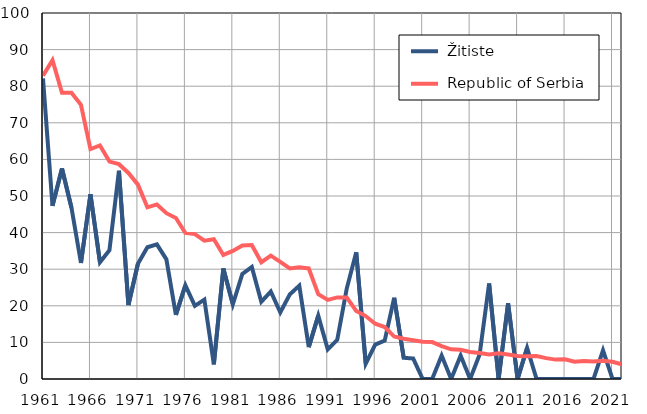
| Category |  Žitiste |  Republic of Serbia |
|---|---|---|
| 1961.0 | 82.1 | 82.9 |
| 1962.0 | 47.3 | 87.1 |
| 1963.0 | 57.5 | 78.2 |
| 1964.0 | 46.8 | 78.2 |
| 1965.0 | 31.7 | 74.9 |
| 1966.0 | 50.5 | 62.8 |
| 1967.0 | 31.9 | 63.8 |
| 1968.0 | 35.2 | 59.4 |
| 1969.0 | 56.9 | 58.7 |
| 1970.0 | 20.2 | 56.3 |
| 1971.0 | 31.5 | 53.1 |
| 1972.0 | 36 | 46.9 |
| 1973.0 | 36.8 | 47.7 |
| 1974.0 | 32.7 | 45.3 |
| 1975.0 | 17.5 | 44 |
| 1976.0 | 25.6 | 39.9 |
| 1977.0 | 20 | 39.6 |
| 1978.0 | 21.7 | 37.8 |
| 1979.0 | 4 | 38.2 |
| 1980.0 | 30.2 | 33.9 |
| 1981.0 | 20.4 | 35 |
| 1982.0 | 28.7 | 36.5 |
| 1983.0 | 30.6 | 36.6 |
| 1984.0 | 21.1 | 31.9 |
| 1985.0 | 23.9 | 33.7 |
| 1986.0 | 18.2 | 32 |
| 1987.0 | 23.1 | 30.2 |
| 1988.0 | 25.5 | 30.5 |
| 1989.0 | 8.7 | 30.2 |
| 1990.0 | 17.3 | 23.2 |
| 1991.0 | 8.1 | 21.6 |
| 1992.0 | 10.7 | 22.3 |
| 1993.0 | 24.7 | 22.3 |
| 1994.0 | 34.6 | 18.6 |
| 1995.0 | 4.2 | 17.2 |
| 1996.0 | 9.4 | 15.1 |
| 1997.0 | 10.5 | 14.2 |
| 1998.0 | 22.2 | 11.6 |
| 1999.0 | 5.8 | 11 |
| 2000.0 | 5.6 | 10.6 |
| 2001.0 | 0 | 10.2 |
| 2002.0 | 0 | 10.1 |
| 2003.0 | 6.4 | 9 |
| 2004.0 | 0 | 8.1 |
| 2005.0 | 6.4 | 8 |
| 2006.0 | 0 | 7.4 |
| 2007.0 | 6.7 | 7.1 |
| 2008.0 | 26.1 | 6.7 |
| 2009.0 | 0 | 7 |
| 2010.0 | 20.7 | 6.7 |
| 2011.0 | 0 | 6.3 |
| 2012.0 | 8.5 | 6.2 |
| 2013.0 | 0 | 6.3 |
| 2014.0 | 0 | 5.7 |
| 2015.0 | 0 | 5.3 |
| 2016.0 | 0 | 5.4 |
| 2017.0 | 0 | 4.7 |
| 2018.0 | 0 | 4.9 |
| 2019.0 | 0 | 4.8 |
| 2020.0 | 7.8 | 5 |
| 2021.0 | 0 | 4.7 |
| 2022.0 | 0 | 4 |